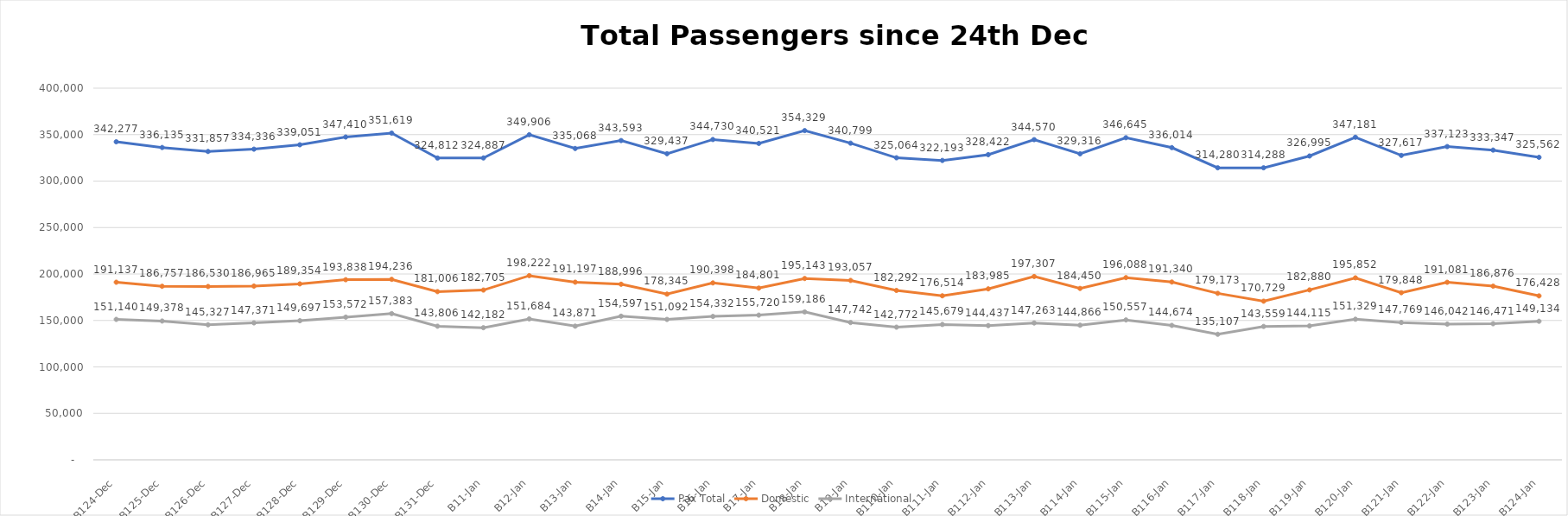
| Category | Pax Total |  Domestic  |  International  |
|---|---|---|---|
| 2022-12-24 | 342277 | 191137 | 151140 |
| 2022-12-25 | 336135 | 186757 | 149378 |
| 2022-12-26 | 331857 | 186530 | 145327 |
| 2022-12-27 | 334336 | 186965 | 147371 |
| 2022-12-28 | 339051 | 189354 | 149697 |
| 2022-12-29 | 347410 | 193838 | 153572 |
| 2022-12-30 | 351619 | 194236 | 157383 |
| 2022-12-31 | 324812 | 181006 | 143806 |
| 2023-01-01 | 324887 | 182705 | 142182 |
| 2023-01-02 | 349906 | 198222 | 151684 |
| 2023-01-03 | 335068 | 191197 | 143871 |
| 2023-01-04 | 343593 | 188996 | 154597 |
| 2023-01-05 | 329437 | 178345 | 151092 |
| 2023-01-06 | 344730 | 190398 | 154332 |
| 2023-01-07 | 340521 | 184801 | 155720 |
| 2023-01-08 | 354329 | 195143 | 159186 |
| 2023-01-09 | 340799 | 193057 | 147742 |
| 2023-01-10 | 325064 | 182292 | 142772 |
| 2023-01-11 | 322193 | 176514 | 145679 |
| 2023-01-12 | 328422 | 183985 | 144437 |
| 2023-01-13 | 344570 | 197307 | 147263 |
| 2023-01-14 | 329316 | 184450 | 144866 |
| 2023-01-15 | 346645 | 196088 | 150557 |
| 2023-01-16 | 336014 | 191340 | 144674 |
| 2023-01-17 | 314280 | 179173 | 135107 |
| 2023-01-18 | 314288 | 170729 | 143559 |
| 2023-01-19 | 326995 | 182880 | 144115 |
| 2023-01-20 | 347181 | 195852 | 151329 |
| 2023-01-21 | 327617 | 179848 | 147769 |
| 2023-01-22 | 337123 | 191081 | 146042 |
| 2023-01-23 | 333347 | 186876 | 146471 |
| 2023-01-24 | 325562 | 176428 | 149134 |